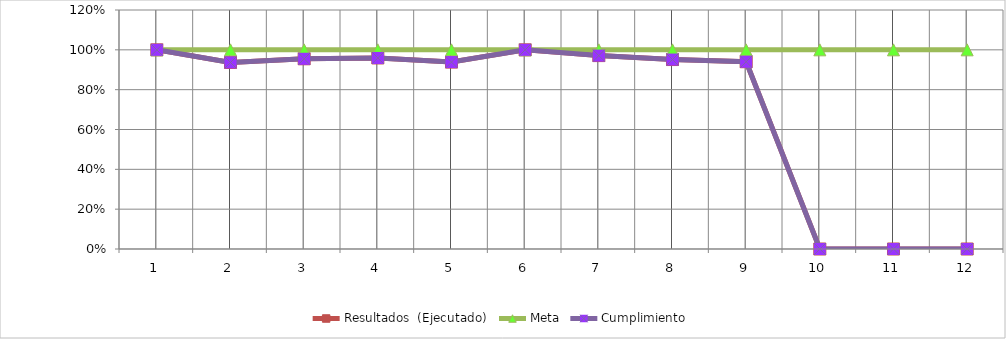
| Category | Resultados  (Ejecutado) | Meta | Cumplimiento |
|---|---|---|---|
| 0 | 1 | 1 | 1 |
| 1 | 0.937 | 1 | 0.937 |
| 2 | 0.955 | 1 | 0.955 |
| 3 | 0.959 | 1 | 0.959 |
| 4 | 0.938 | 1 | 0.938 |
| 5 | 1 | 1 | 1 |
| 6 | 0.971 | 1 | 0.971 |
| 7 | 0.951 | 1 | 0.951 |
| 8 | 0.94 | 1 | 0.94 |
| 9 | 0 | 1 | 0 |
| 10 | 0 | 1 | 0 |
| 11 | 0 | 1 | 0 |